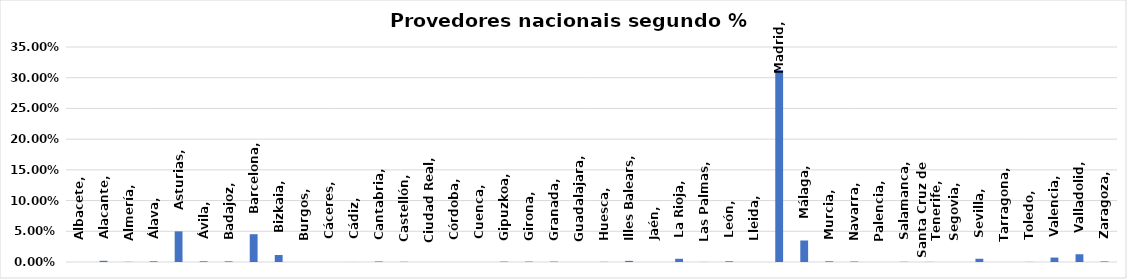
| Category | Series 0 |
|---|---|
| Albacete | 0 |
| Alacante | 0.002 |
| Almería | 0 |
| Álava | 0.001 |
| Asturias | 0.05 |
| Ávila | 0.001 |
| Badajoz | 0.001 |
| Barcelona | 0.045 |
| Bizkaia | 0.011 |
| Burgos | 0 |
| Cáceres | 0 |
| Cádiz | 0 |
| Cantabria | 0.001 |
| Castellón | 0 |
| Ciudad Real | 0 |
| Córdoba | 0 |
| Cuenca | 0 |
| Gipuzkoa | 0.001 |
| Girona | 0.001 |
| Granada | 0.001 |
| Guadalajara | 0 |
| Huesca | 0 |
| Illes Balears | 0.002 |
| Jaén | 0 |
| La Rioja | 0.005 |
| Las Palmas | 0 |
| León | 0.001 |
| Lleida | 0 |
| Madrid | 0.312 |
| Málaga | 0.035 |
| Murcia | 0.001 |
| Navarra | 0.001 |
| Palencia | 0 |
| Salamanca | 0 |
| Santa Cruz de Tenerife | 0 |
| Segovia | 0 |
| Sevilla | 0.005 |
| Tarragona | 0 |
| Toledo | 0 |
| Valencia | 0.007 |
| Valladolid | 0.013 |
| Zaragoza | 0.001 |